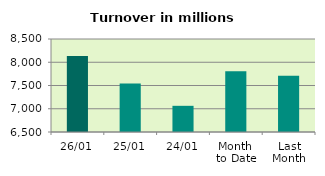
| Category | Series 0 |
|---|---|
| 26/01 | 8134.5 |
| 25/01 | 7543.841 |
| 24/01 | 7063.082 |
| Month 
to Date | 7807.331 |
| Last
Month | 7707.734 |